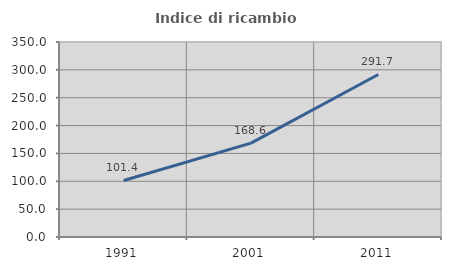
| Category | Indice di ricambio occupazionale  |
|---|---|
| 1991.0 | 101.415 |
| 2001.0 | 168.578 |
| 2011.0 | 291.745 |